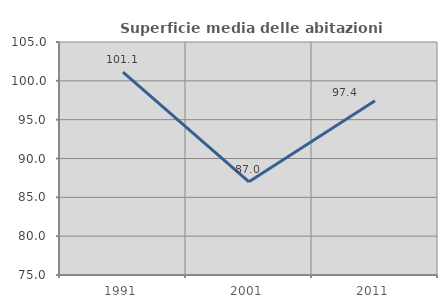
| Category | Superficie media delle abitazioni occupate |
|---|---|
| 1991.0 | 101.106 |
| 2001.0 | 87 |
| 2011.0 | 97.429 |